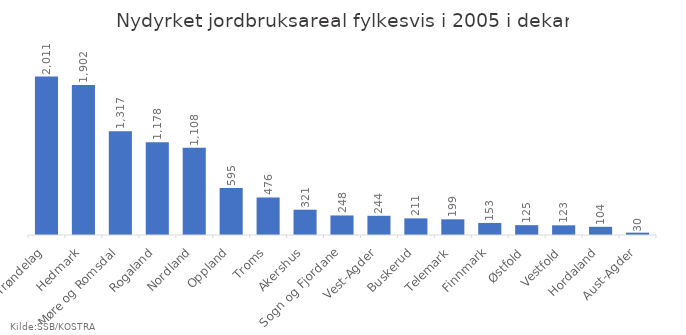
| Category | Totalt |
|---|---|
| Trøndelag | 2011 |
| Hedmark | 1902 |
| Møre og Romsdal | 1317 |
| Rogaland | 1178 |
| Nordland | 1108 |
| Oppland | 595 |
| Troms | 476 |
| Akershus | 321 |
| Sogn og Fjordane | 248 |
| Vest-Agder | 244 |
| Buskerud | 211 |
| Telemark | 199 |
| Finnmark | 153 |
| Østfold | 125 |
| Vestfold | 123 |
| Hordaland | 104 |
| Aust-Agder | 30 |